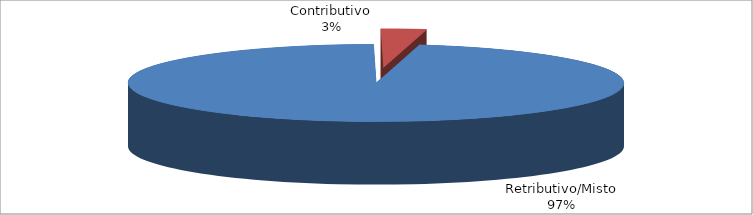
| Category | Decorrenti gennaio - settembre 2020 |
|---|---|
| Retributivo/Misto | 26793 |
| Contributivo | 813 |